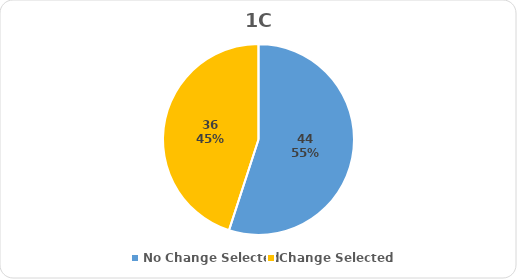
| Category | Series 0 |
|---|---|
| No Change Selected | 44 |
| Change Selected | 36 |